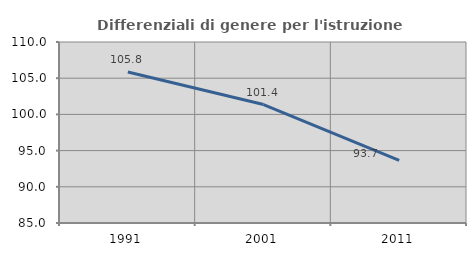
| Category | Differenziali di genere per l'istruzione superiore |
|---|---|
| 1991.0 | 105.847 |
| 2001.0 | 101.359 |
| 2011.0 | 93.661 |